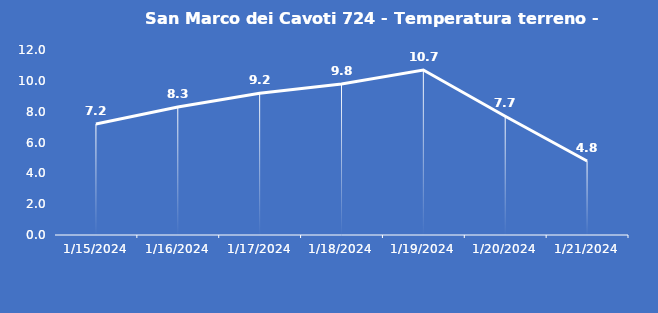
| Category | San Marco dei Cavoti 724 - Temperatura terreno - Grezzo (°C) |
|---|---|
| 1/15/24 | 7.2 |
| 1/16/24 | 8.3 |
| 1/17/24 | 9.2 |
| 1/18/24 | 9.8 |
| 1/19/24 | 10.7 |
| 1/20/24 | 7.7 |
| 1/21/24 | 4.8 |